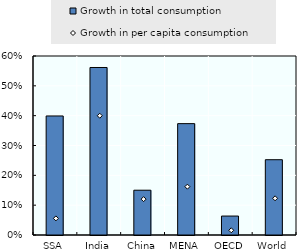
| Category | Growth in total consumption |
|---|---|
| SSA | 0.399 |
| India | 0.561 |
| China | 0.15 |
| MENA | 0.373 |
| OECD | 0.064 |
| World | 0.252 |